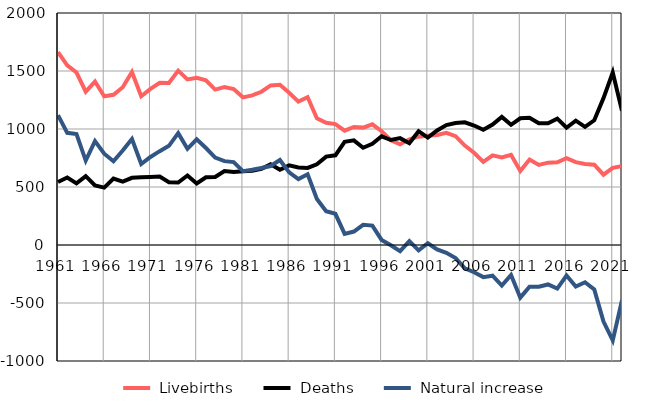
| Category |  Livebirths |  Deaths |  Natural increase |
|---|---|---|---|
| 1961.0 | 1662 | 543 | 1119 |
| 1962.0 | 1549 | 582 | 967 |
| 1963.0 | 1487 | 531 | 956 |
| 1964.0 | 1322 | 594 | 728 |
| 1965.0 | 1409 | 513 | 896 |
| 1966.0 | 1282 | 495 | 787 |
| 1967.0 | 1295 | 573 | 722 |
| 1968.0 | 1360 | 546 | 814 |
| 1969.0 | 1492 | 579 | 913 |
| 1970.0 | 1282 | 584 | 698 |
| 1971.0 | 1346 | 587 | 759 |
| 1972.0 | 1399 | 590 | 809 |
| 1973.0 | 1396 | 541 | 855 |
| 1974.0 | 1503 | 539 | 964 |
| 1975.0 | 1428 | 599 | 829 |
| 1976.0 | 1441 | 530 | 911 |
| 1977.0 | 1420 | 584 | 836 |
| 1978.0 | 1340 | 586 | 754 |
| 1979.0 | 1361 | 638 | 723 |
| 1980.0 | 1345 | 630 | 715 |
| 1981.0 | 1273 | 636 | 637 |
| 1982.0 | 1290 | 641 | 649 |
| 1983.0 | 1321 | 657 | 664 |
| 1984.0 | 1376 | 695 | 681 |
| 1985.0 | 1381 | 648 | 733 |
| 1986.0 | 1312 | 686 | 626 |
| 1987.0 | 1236 | 668 | 568 |
| 1988.0 | 1274 | 664 | 610 |
| 1989.0 | 1093 | 696 | 397 |
| 1990.0 | 1053 | 762 | 291 |
| 1991.0 | 1042 | 773 | 269 |
| 1992.0 | 986 | 890 | 96 |
| 1993.0 | 1018 | 902 | 116 |
| 1994.0 | 1012 | 838 | 174 |
| 1995.0 | 1040 | 873 | 167 |
| 1996.0 | 981 | 937 | 44 |
| 1997.0 | 903 | 905 | -2 |
| 1998.0 | 868 | 921 | -53 |
| 1999.0 | 911 | 878 | 33 |
| 2000.0 | 934 | 981 | -47 |
| 2001.0 | 941 | 926 | 15 |
| 2002.0 | 949 | 987 | -38 |
| 2003.0 | 967 | 1034 | -67 |
| 2004.0 | 938 | 1051 | -113 |
| 2005.0 | 857 | 1058 | -201 |
| 2006.0 | 795 | 1030 | -235 |
| 2007.0 | 716 | 993 | -277 |
| 2008.0 | 773 | 1038 | -265 |
| 2009.0 | 754 | 1104 | -350 |
| 2010.0 | 778 | 1036 | -258 |
| 2011.0 | 638 | 1092 | -454 |
| 2012.0 | 737 | 1097 | -360 |
| 2013.0 | 690 | 1049 | -359 |
| 2014.0 | 710 | 1050 | -340 |
| 2015.0 | 713 | 1089 | -376 |
| 2016.0 | 748 | 1011 | -263 |
| 2017.0 | 714 | 1072 | -358 |
| 2018.0 | 698 | 1019 | -321 |
| 2019.0 | 692 | 1075 | -383 |
| 2020.0 | 606 | 1266 | -660 |
| 2021.0 | 665 | 1487 | -822 |
| 2022.0 | 681 | 1157 | -476 |